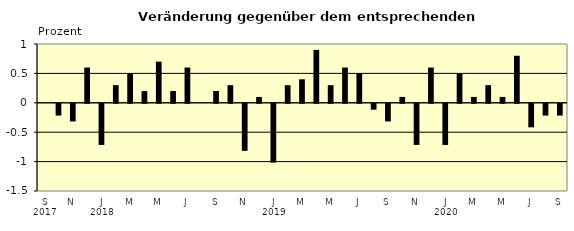
| Category | Series 0 |
|---|---|
| 0 | 0 |
| 1 | -0.2 |
| 2 | -0.3 |
| 3 | 0.6 |
| 4 | -0.7 |
| 5 | 0.3 |
| 6 | 0.5 |
| 7 | 0.2 |
| 8 | 0.7 |
| 9 | 0.2 |
| 10 | 0.6 |
| 11 | 0 |
| 12 | 0.2 |
| 13 | 0.3 |
| 14 | -0.8 |
| 15 | 0.1 |
| 16 | -1 |
| 17 | 0.3 |
| 18 | 0.4 |
| 19 | 0.9 |
| 20 | 0.3 |
| 21 | 0.6 |
| 22 | 0.5 |
| 23 | -0.1 |
| 24 | -0.3 |
| 25 | 0.1 |
| 26 | -0.7 |
| 27 | 0.6 |
| 28 | -0.7 |
| 29 | 0.5 |
| 30 | 0.1 |
| 31 | 0.3 |
| 32 | 0.1 |
| 33 | 0.8 |
| 34 | -0.4 |
| 35 | -0.2 |
| 36 | -0.2 |